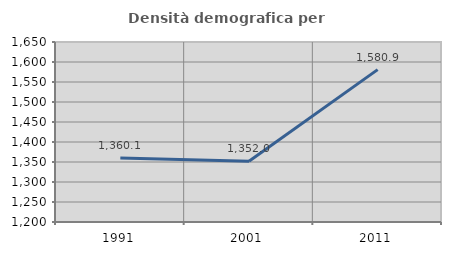
| Category | Densità demografica |
|---|---|
| 1991.0 | 1360.095 |
| 2001.0 | 1351.951 |
| 2011.0 | 1580.914 |